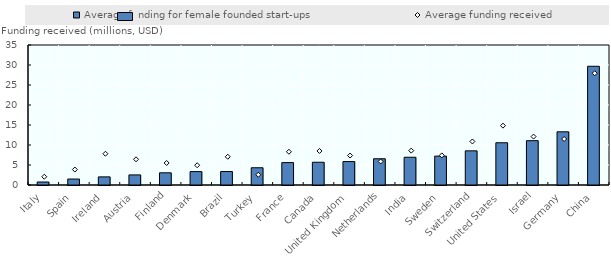
| Category | Average funding for female founded start-ups |
|---|---|
| Italy | 0.75 |
| Spain | 1.49 |
| Ireland | 2.03 |
| Austria | 2.52 |
| Finland | 3.05 |
| Denmark | 3.35 |
| Brazil | 3.37 |
| Turkey | 4.31 |
| France | 5.6 |
| Canada | 5.69 |
| United Kingdom | 5.86 |
| Netherlands | 6.56 |
| India | 6.94 |
| Sweden | 7.22 |
| Switzerland | 8.54 |
| United States | 10.56 |
| Israel | 11.08 |
| Germany | 13.3 |
| China | 29.68 |